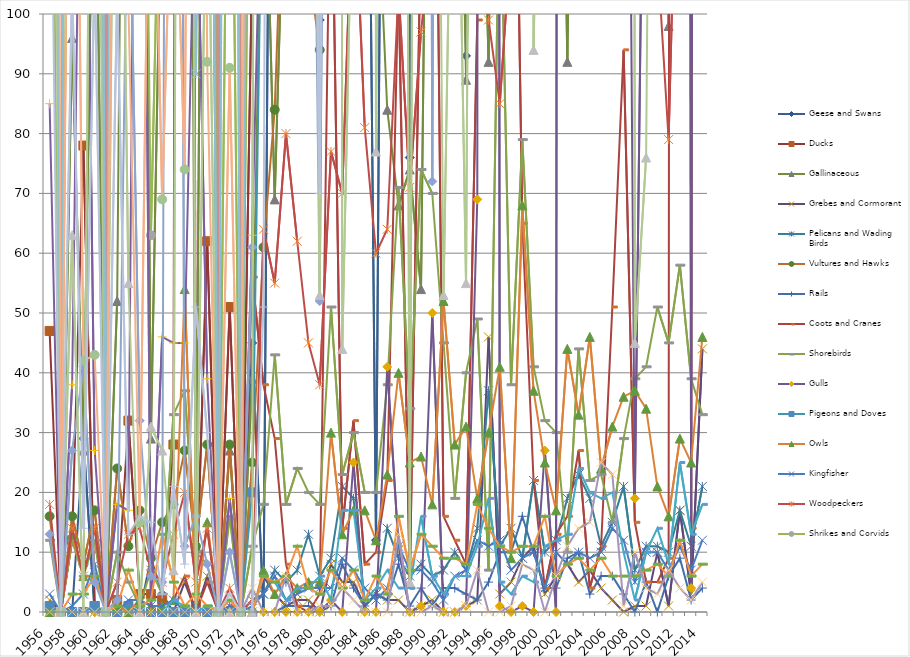
| Category | Geese and Swans | Ducks | Gallinaceous | Grebes and Cormorants | Pelicans and Wading Birds | Vultures and Hawks | Rails | Coots and Cranes | Shorebirds | Gulls | Pigeons and Doves | Owls | Kingfisher | Woodpeckers | Shrikes and Corvids | Larks, Nuthatches, Chickadees, and Kinglets | Wrens | Dippers | Thrushes | Starlings | Pipits, Waxwings, Longspurs | Warblers | Sparrows and Juncos | Blackbirds | Finches |
|---|---|---|---|---|---|---|---|---|---|---|---|---|---|---|---|---|---|---|---|---|---|---|---|---|---|
| 1956.0 | 0 | 47 | 163 | 2 | 0 | 16 | 1 | 0 | 12 | 0 | 1 | 0 | 3 | 18 | 183 | 85 | 0 | 0 | 13 | 364 | 276 | 0 | 447 | 987 | 147 |
| 1957.0 | 0 | 0 | 0 | 0 | 0 | 0 | 0 | 0 | 0 | 0 | 0 | 0 | 0 | 0 | 0 | 0 | 0 | 0 | 0 | 0 | 0 | 0 | 0 | 0 | 0 |
| 1958.0 | 0 | 12 | 96 | 0 | 0 | 16 | 0 | 0 | 12 | 0 | 0 | 13 | 1 | 14 | 233 | 38 | 0 | 3 | 27 | 714 | 63 | 0 | 505 | 218 | 106 |
| 1959.0 | 29 | 78 | 27 | 0 | 0 | 8 | 0 | 0 | 6 | 0 | 0 | 6 | 3 | 6 | 196 | 176 | 0 | 3 | 41 | 1327 | 0 | 0 | 313 | 42 | 14 |
| 1960.0 | 0 | 1 | 146 | 0 | 0 | 17 | 0 | 0 | 12 | 0 | 1 | 6 | 8 | 14 | 269 | 27 | 0 | 6 | 5 | 1330 | 240 | 0 | 456 | 43 | 108 |
| 1961.0 | 0 | 0 | 0 | 0 | 0 | 0 | 0 | 0 | 0 | 0 | 0 | 0 | 0 | 0 | 0 | 0 | 0 | 0 | 0 | 0 | 0 | 0 | 0 | 0 | 0 |
| 1962.0 | 0 | 2 | 52 | 0 | 0 | 24 | 0 | 0 | 10 | 0 | 0 | 1 | 0 | 5 | 1122 | 18 | 0 | 1 | 2 | 1200 | 200 | 0 | 346 | 241 | 104 |
| 1963.0 | 0 | 32 | 260 | 0 | 0 | 11 | 0 | 0 | 5 | 0 | 1 | 0 | 2 | 13 | 571 | 17 | 0 | 7 | 134 | 1000 | 55 | 0 | 350 | 102 | 13 |
| 1964.0 | 0 | 3 | 270 | 0 | 0 | 17 | 0 | 0 | 1 | 0 | 0 | 2 | 2 | 14 | 232 | 251 | 0 | 1 | 32 | 1600 | 0 | 0 | 1442 | 15 | 16 |
| 1965.0 | 9 | 3 | 29 | 0 | 0 | 9 | 0 | 0 | 7 | 0 | 0 | 1 | 1 | 7 | 63 | 0 | 0 | 2 | 6 | 1400 | 31 | 0 | 665 | 155 | 15 |
| 1966.0 | 3 | 2 | 130 | 0 | 0 | 15 | 0 | 0 | 3 | 0 | 0 | 1 | 1 | 5 | 147 | 46 | 0 | 13 | 5 | 1900 | 27 | 0 | 103 | 69 | 3 |
| 1967.0 | 0 | 28 | 540 | 0 | 0 | 18 | 0 | 2 | 33 | 0 | 0 | 2 | 2 | 13 | 270 | 45 | 2 | 5 | 602 | 1300 | 7 | 0 | 1277 | 136 | 21 |
| 1968.0 | 0 | 893 | 320 | 5 | 0 | 27 | 0 | 6 | 37 | 0 | 0 | 54 | 0 | 20 | 295 | 45 | 1 | 1 | 11 | 600 | 586 | 0 | 353 | 74 | 8 |
| 1969.0 | 0 | 1 | 11 | 0 | 0 | 11 | 0 | 0 | 10 | 0 | 0 | 0 | 1 | 5 | 111 | 131 | 0 | 3 | 16 | 2100 | 0 | 0 | 90 | 363 | 51 |
| 1970.0 | 0 | 62 | 270 | 6 | 0 | 28 | 0 | 5 | 8 | 0 | 0 | 15 | 0 | 14 | 526 | 39 | 1 | 1 | 8 | 1000 | 140 | 0 | 267 | 92 | 30 |
| 1971.0 | 0 | 0 | 0 | 0 | 0 | 0 | 0 | 0 | 0 | 0 | 0 | 0 | 0 | 0 | 0 | 0 | 0 | 0 | 0 | 0 | 0 | 0 | 0 | 0 | 0 |
| 1972.0 | 0 | 51 | 27 | 0 | 1 | 28 | 0 | 1 | 16 | 0 | 0 | 0 | 1 | 4 | 171 | 19 | 0 | 2 | 10 | 2185 | 0 | 0 | 412 | 91 | 3 |
| 1973.0 | 0 | 0 | 0 | 0 | 0 | 0 | 0 | 0 | 0 | 0 | 0 | 0 | 0 | 0 | 0 | 0 | 0 | 0 | 0 | 0 | 0 | 0 | 0 | 0 | 0 |
| 1974.0 | 45 | 109 | 39 | 0 | 2 | 25 | 0 | 56 | 11 | 0 | 20 | 0 | 1 | 2 | 191 | 63 | 0 | 0 | 61 | 300 | 0 | 4 | 259 | 453 | 0 |
| 1975.0 | 0 | 4042 | 140 | 6 | 3 | 61 | 0 | 38 | 18 | 0 | 140 | 7 | 3 | 64 | 517 | 141 | 6 | 6 | 654 | 3629 | 1237 | 0 | 1020 | 537 | 51 |
| 1976.0 | 261 | 855 | 69 | 3 | 7 | 84 | 0 | 29 | 43 | 0 | 389 | 3 | 6 | 55 | 699 | 732 | 5 | 5 | 242 | 2712 | 732 | 0 | 1607 | 4178 | 539 |
| 1977.0 | 366 | 1873 | 135 | 1 | 5 | 137 | 1 | 8 | 18 | 0 | 362 | 6 | 2 | 80 | 518 | 348 | 2 | 6 | 319 | 4814 | 251 | 6 | 1667 | 3551 | 360 |
| 1978.0 | 1259 | 1478 | 202 | 2 | 7 | 118 | 1 | 1 | 24 | 0 | 487 | 4 | 3 | 62 | 1222 | 487 | 4 | 11 | 641 | 2746 | 226 | 0 | 1009 | 1064 | 208 |
| 1979.0 | 120 | 1368 | 165 | 2 | 13 | 108 | 1 | 0 | 20 | 0 | 426 | 5 | 4 | 45 | 829 | 201 | 4 | 4 | 214 | 4744 | 317 | 0 | 721 | 1286 | 226 |
| 1980.0 | 99 | 935 | 133 | 0 | 6 | 94 | 0 | 3 | 18 | 0 | 300 | 5 | 4 | 38 | 386 | 117 | 6 | 3 | 52 | 3820 | 53 | 1 | 811 | 1609 | 70 |
| 1981.0 | 261 | 2574 | 570 | 8 | 9 | 252 | 1 | 134 | 51 | 2 | 286 | 30 | 4 | 77 | 749 | 274 | 2 | 7 | 325 | 8862 | 2742 | 1 | 1164 | 1288 | 346 |
| 1982.0 | 194 | 2673 | 329 | 5 | 21 | 128 | 8 | 14 | 23 | 0 | 227 | 13 | 9 | 70 | 1624 | 308 | 17 | 4 | 341 | 2987 | 44 | 4 | 2009 | 786 | 257 |
| 1983.0 | 179 | 3328 | 303 | 5 | 19 | 193 | 4 | 32 | 30 | 25 | 309 | 17 | 7 | 126 | 1188 | 804 | 17 | 7 | 366 | 7723 | 133 | 2 | 2668 | 2117 | 934 |
| 1984.0 | 208 | 2318 | 147 | 1 | 1 | 145 | 1 | 8 | 20 | 0 | 402 | 17 | 4 | 81 | 563 | 339 | 2 | 2 | 465 | 3562 | 2739 | 0 | 1224 | 446 | 1506 |
| 1985.0 | 12 | 1391 | 127 | 3 | 3 | 123 | 3 | 10 | 20 | 0 | 178 | 12 | 2 | 60 | 967 | 355 | 4 | 6 | 254 | 7234 | 77 | 0 | 3329 | 382 | 539 |
| 1986.0 | 290 | 2775 | 84 | 2 | 14 | 112 | 2 | 22 | 38 | 41 | 302 | 23 | 4 | 64 | 624 | 192 | 7 | 3 | 234 | 9741 | 407 | 0 | 1712 | 2778 | 936 |
| 1987.0 | 250 | 1778 | 68 | 2 | 9 | 204 | 8 | 106 | 71 | 11 | 279 | 40 | 11 | 104 | 821 | 515 | 4 | 16 | 1215 | 5374 | 618 | 13 | 2184 | 4225 | 2121 |
| 1988.0 | 76 | 1016 | 74 | 0 | 6 | 115 | 1 | 4 | 34 | 0 | 378 | 25 | 7 | 71 | 691 | 249 | 4 | 7 | 112 | 6088 | 5 | 0 | 1969 | 965 | 801 |
| 1989.0 | 1014 | 1710 | 54 | 1 | 8 | 239 | 4 | 117 | 74 | 1 | 369 | 26 | 7 | 97 | 718 | 448 | 16 | 13 | 801 | 5754 | 510 | 0 | 2241 | 1843 | 2809 |
| 1990.0 | 228 | 1428 | 226 | 2 | 6 | 247 | 1 | 197 | 70 | 50 | 568 | 18 | 5 | 115 | 887 | 525 | 6 | 11 | 72 | 2702 | 264 | 1 | 2191 | 842 | 619 |
| 1991.0 | 504 | 1661 | 201 | 0 | 7 | 252 | 4 | 16 | 45 | 0 | 838 | 52 | 2 | 102 | 782 | 314 | 3 | 9 | 511 | 4494 | 53 | 0 | 2310 | 296 | 1022 |
| 1992.0 | 175 | 1267 | 188 | 0 | 10 | 175 | 4 | 12 | 19 | 0 | 635 | 28 | 6 | 115 | 786 | 835 | 6 | 9 | 191 | 3541 | 166 | 0 | 3176 | 741 | 2036 |
| 1993.0 | 93 | 1252 | 89 | 1 | 7 | 206 | 3 | 8 | 40 | 1 | 457 | 31 | 7 | 115 | 449 | 313 | 6 | 8 | 366 | 3948 | 55 | 1 | 2513 | 615 | 1467 |
| 1994.0 | 493 | 2611 | 164 | 2 | 14 | 217 | 2 | 99 | 49 | 69 | 590 | 19 | 12 | 121 | 652 | 541 | 11 | 18 | 762 | 4938 | 386 | 7 | 2197 | 1010 | 1075 |
| 1995.0 | 531 | 2552 | 92 | 46 | 37 | 239 | 5 | 1232 | 7 | 2358 | 484 | 30 | 11 | 99 | 823 | 600 | 19 | 14 | 241 | 9182 | 363 | 0 | 2348 | 863 | 826 |
| 1996.0 | 425 | 2851 | 216 | 3 | 11 | 549 | 10 | 101 | 127 | 1 | 544 | 41 | 12 | 85 | 974 | 895 | 5 | 11 | 248 | 5722 | 2519 | 0 | 2703 | 1646 | 3911 |
| 1997.0 | 297 | 3284 | 236 | 5 | 14 | 152 | 10 | 188 | 38 | 0 | 384 | 9 | 7 | 113 | 487 | 318 | 3 | 10 | 443 | 4597 | 142 | 1 | 2789 | 620 | 663 |
| 1998.0 | 354 | 2183 | 251 | 9 | 9 | 297 | 16 | 65 | 79 | 1 | 216 | 68 | 9 | 116 | 627 | 400 | 6 | 11 | 620 | 3675 | 1049 | 8 | 2954 | 1938 | 883 |
| 1999.0 | 695 | 5782 | 291 | 11 | 22 | 667 | 10 | 22 | 41 | 0 | 598 | 37 | 10 | 101 | 1378 | 357 | 5 | 11 | 351 | 7056 | 94 | 7 | 2751 | 1785 | 815 |
| 2000.0 | 672 | 3151 | 178 | 3 | 10 | 225 | 4 | 4 | 32 | 27 | 399 | 25 | 4 | 125 | 402 | 641 | 11 | 16 | 1171 | 3561 | 197 | 0 | 2386 | 1325 | 1428 |
| 2001.0 | 107 | 3354 | 211 | 6 | 12 | 328 | 4 | 13 | 30 | 0 | 740 | 17 | 10 | 138 | 516 | 806 | 12 | 6 | 797 | 5076 | 162 | 6 | 4267 | 496 | 1301 |
| 2002.0 | 524 | 5218 | 92 | 8 | 19 | 498 | 9 | 16 | 10 | 2187 | 781 | 44 | 8 | 132 | 778 | 339 | 13 | 8 | 924 | 66273 | 292 | 11 | 2480 | 3410 | 980 |
| 2003.0 | 1410 | 5380 | 216 | 5 | 23 | 412 | 10 | 27 | 44 | 582 | 1178 | 33 | 10 | 125 | 1204 | 692 | 24 | 9 | 373 | 9113 | 205 | 14 | 3975 | 849 | 1063 |
| 2004.0 | 797 | 2607 | 146 | 7 | 19 | 334 | 3 | 4 | 22 | 772 | 324 | 46 | 9 | 123 | 631 | 410 | 20 | 7 | 123 | 8753 | 200 | 15 | 2297 | 612 | 1097 |
| 2005.0 | 664 | 2072 | 300 | 4 | 11 | 231 | 6 | 11 | 23 | 121 | 629 | 24 | 10 | 147 | 775 | 920 | 19 | 9 | 317 | 20037 | 188 | 25 | 6642 | 1367 | 1083 |
| 2006.0 | 493 | 1994 | 104 | 2 | 15 | 302 | 6 | 51 | 15 | 659 | 463 | 31 | 14 | 171 | 791 | 624 | 20 | 6 | 903 | 14632 | 122 | 23 | 3252 | 4458 | 832 |
| 2007.0 | 720 | 4030 | 337 | 0 | 21 | 397 | 3 | 94 | 29 | 266 | 1571 | 36 | 12 | 121 | 738 | 1013 | 10 | 6 | 411 | 12413 | 2043 | 1 | 2767 | 1229 | 1846 |
| 2008.0 | 383 | 2870 | 242 | 1 | 7 | 372 | 0 | 15 | 39 | 19 | 543 | 37 | 5 | 129 | 636 | 347 | 2 | 6 | 600 | 17658 | 45 | 10 | 2599 | 1872 | 1199 |
| 2009.0 | 206 | 2858 | 143 | 1 | 11 | 282 | 5 | 5 | 41 | 175 | 568 | 34 | 10 | 116 | 647 | 438 | 10 | 7 | 167 | 10108 | 76 | 4 | 2368 | 791 | 917 |
| 2010.0 | 143 | 1962 | 256 | 10 | 11 | 282 | 0 | 5 | 51 | 205 | 865 | 21 | 10 | 110 | 569 | 271 | 14 | 8 | 602 | 29824 | 308 | 3 | 1455 | 402 | 901 |
| 2011.0 | 517 | 2233 | 98 | 1 | 10 | 144 | 6 | 9 | 45 | 841 | 670 | 16 | 7 | 79 | 558 | 166 | 8 | 6 | 690 | 7622 | 131 | 7 | 1484 | 842 | 511 |
| 2012.0 | 2405 | 8750 | 187 | 17 | 17 | 419 | 9 | 2419 | 58 | 2326 | 694 | 29 | 11 | 152 | 749 | 1347 | 25 | 12 | 391 | 10394 | 654 | 4 | 2414 | 2535 | 1339 |
| 2013.0 | 833 | 2420 | 232 | 3 | 11 | 461 | 2 | 14 | 39 | 4 | 1502 | 25 | 7 | 149 | 806 | 380 | 13 | 6 | 1081 | 9348 | 262 | 2 | 4854 | 3930 | 974 |
| 2014.0 | 1231 | 4680 | 301 | 44 | 21 | 473 | 4 | 1809 | 33 | 2376 | 1478 | 46 | 12 | 119 | 791 | 288 | 18 | 8 | 1023 | 33132 | 148 | 5 | 3356 | 1465 | 1055 |